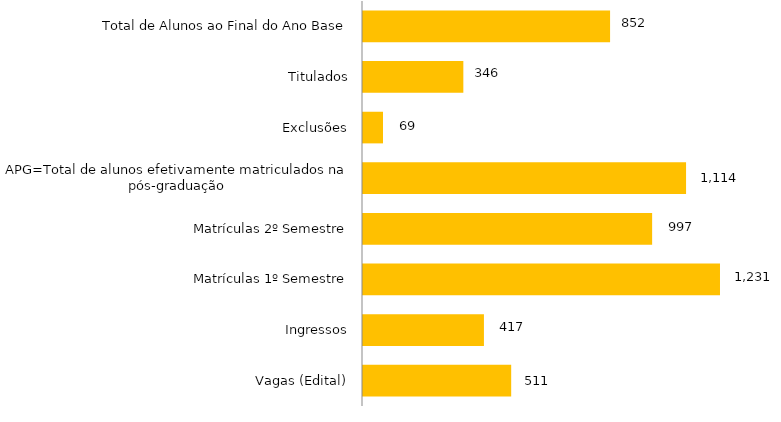
| Category | Curso |
|---|---|
| Vagas (Edital) | 511 |
| Ingressos | 417 |
| Matrículas 1º Semestre | 1231 |
| Matrículas 2º Semestre | 997 |
| APG=Total de alunos efetivamente matriculados na pós-graduação | 1114 |
| Exclusões | 69 |
| Titulados | 346 |
| Total de Alunos ao Final do Ano Base | 852 |